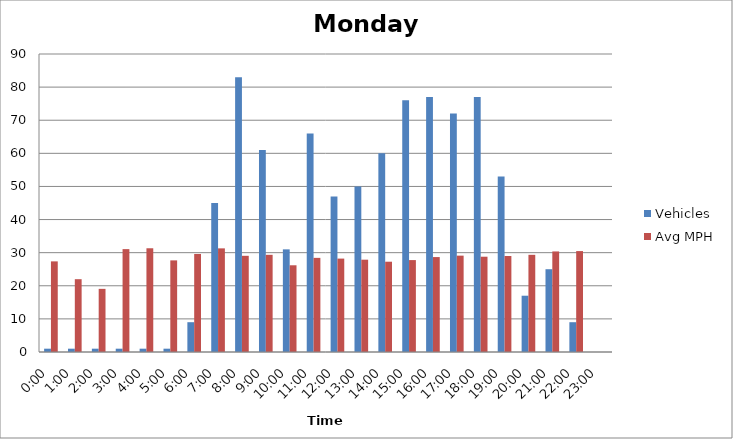
| Category | Vehicles | Avg MPH |
|---|---|---|
| 0:00 | 1 | 27.37 |
| 1:00 | 1 | 21.99 |
| 2:00 | 1 | 19.07 |
| 3:00 | 1 | 31.07 |
| 4:00 | 1 | 31.33 |
| 5:00 | 1 | 27.67 |
| 6:00 | 9 | 29.61 |
| 7:00 | 45 | 31.3 |
| 8:00 | 83 | 29.05 |
| 9:00 | 61 | 29.35 |
| 10:00 | 31 | 26.19 |
| 11:00 | 66 | 28.43 |
| 12:00 | 47 | 28.21 |
| 13:00 | 50 | 27.88 |
| 14:00 | 60 | 27.27 |
| 15:00 | 76 | 27.76 |
| 16:00 | 77 | 28.67 |
| 17:00 | 72 | 29.1 |
| 18:00 | 77 | 28.78 |
| 19:00 | 53 | 29 |
| 20:00 | 17 | 29.35 |
| 21:00 | 25 | 30.37 |
| 22:00 | 9 | 30.48 |
| 23:00 | 0 | 0 |